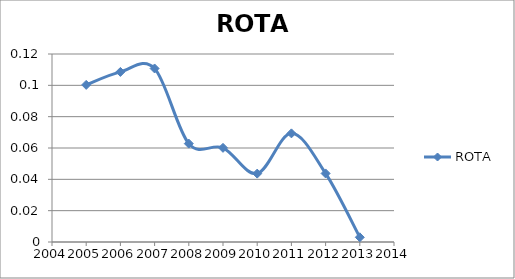
| Category | ROTA  |
|---|---|
| 2005.0 | 0.1 |
| 2006.0 | 0.109 |
| 2007.0 | 0.111 |
| 2008.0 | 0.063 |
| 2009.0 | 0.06 |
| 2010.0 | 0.044 |
| 2011.0 | 0.069 |
| 2012.0 | 0.044 |
| 2013.0 | 0.003 |